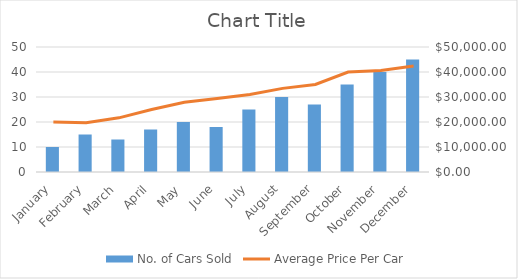
| Category | No. of Cars Sold |
|---|---|
| January | 10 |
| February | 15 |
| March | 13 |
| April | 17 |
| May | 20 |
| June | 18 |
| July | 25 |
| August | 30 |
| September | 27 |
| October | 35 |
| November | 40 |
| December | 45 |